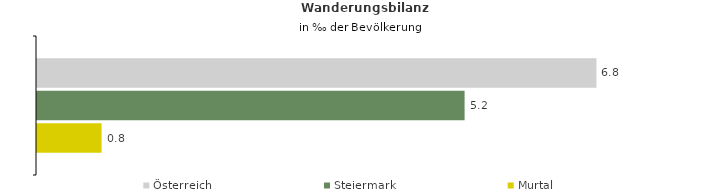
| Category | Österreich | Steiermark | Murtal |
|---|---|---|---|
| Wanderungsrate in ‰ der Bevölkerung, Periode 2015-2019 | 6.771 | 5.175 | 0.781 |